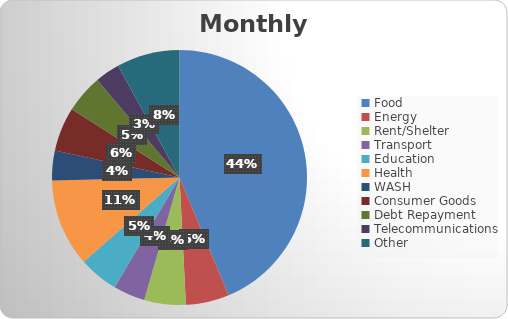
| Category | Series 0 |
|---|---|
| Food  | 145453.533 |
| Energy | 18307.951 |
| Rent/Shelter | 17542.366 |
| Transport | 13379.059 |
| Education | 16747.49 |
| Health | 36990.482 |
| WASH | 12466.405 |
| Consumer Goods | 18660.134 |
| Debt Repayment | 16209.72 |
| Telecommunications | 10430.795 |
| Other  | 26650.626 |